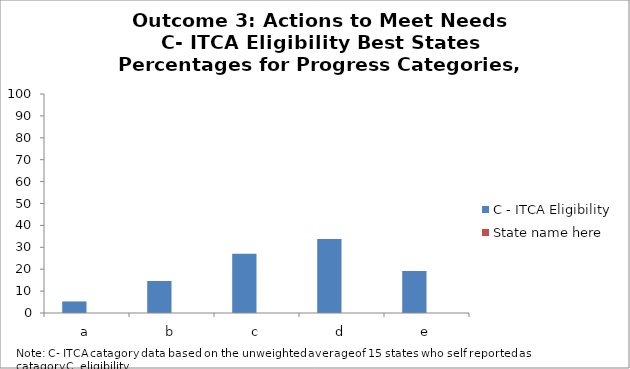
| Category | C - ITCA Eligibility | State name here |
|---|---|---|
| a | 5.28 |  |
| b | 14.6 |  |
| c | 27.1 |  |
| d | 33.8 |  |
| e | 19.2 |  |